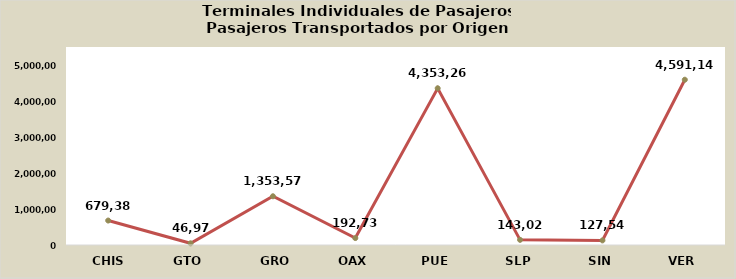
| Category | Total general |
|---|---|
| CHIS | 679382 |
| GTO | 46972 |
| GRO | 1353576 |
| OAX | 192735 |
| PUE | 4353263 |
| SLP | 143023 |
| SIN | 127549 |
| VER | 4591140 |